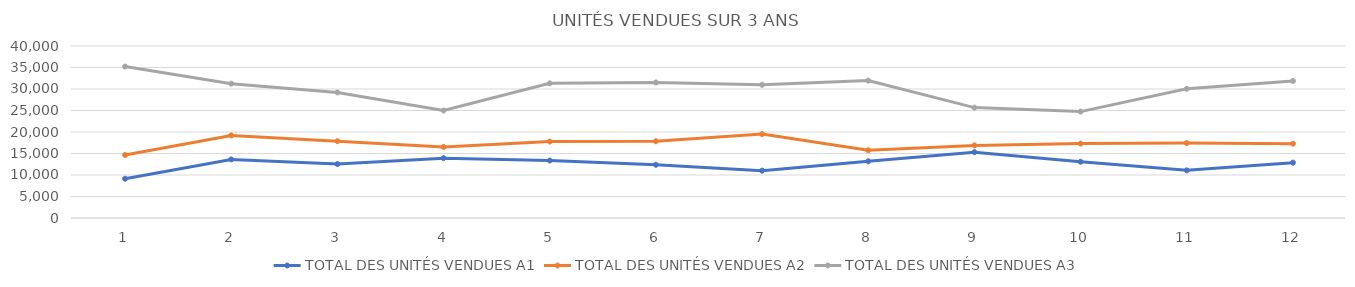
| Category | TOTAL DES UNITÉS VENDUES A1 | TOTAL DES UNITÉS VENDUES A2 | TOTAL DES UNITÉS VENDUES A3 |
|---|---|---|---|
| 0 | 9129 | 14647 | 35215 |
| 1 | 13628 | 19204 | 31243 |
| 2 | 12539 | 17864 | 29198 |
| 3 | 13910 | 16530 | 24992 |
| 4 | 13356 | 17775 | 31314 |
| 5 | 12381 | 17858 | 31508 |
| 6 | 11005 | 19508 | 30973 |
| 7 | 13184 | 15750 | 31959 |
| 8 | 15306 | 16882 | 25671 |
| 9 | 13088 | 17301 | 24743 |
| 10 | 11079 | 17423 | 30043 |
| 11 | 12870 | 17275 | 31855 |